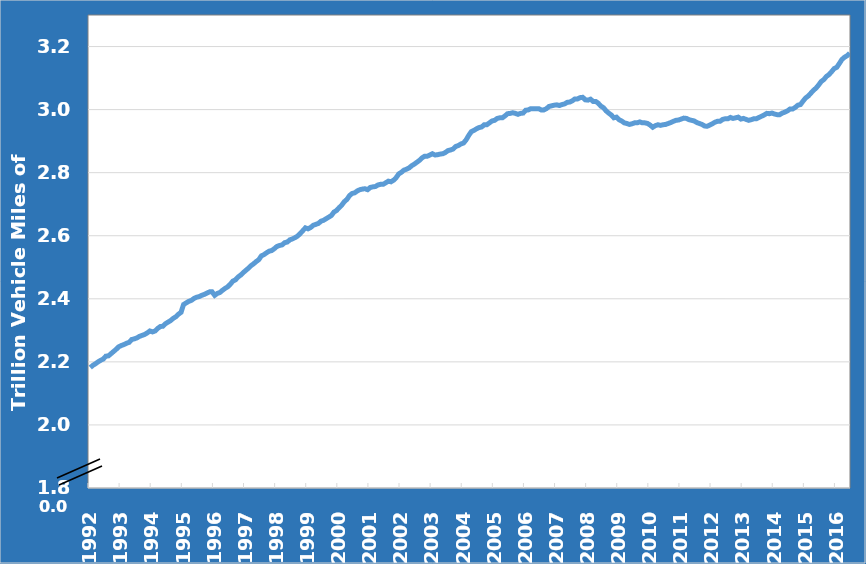
| Category | Series 0 |
|---|---|
| 1992 | 2.182 |
| 1992 | 2.189 |
| 1992 | 2.194 |
| 1992 | 2.2 |
| 1992 | 2.205 |
| 1992 | 2.209 |
| 1992 | 2.218 |
| 1992 | 2.219 |
| 1992 | 2.226 |
| 1992 | 2.233 |
| 1992 | 2.24 |
| 1992 | 2.248 |
| 1993 | 2.252 |
| 1993 | 2.255 |
| 1993 | 2.259 |
| 1993 | 2.262 |
| 1993 | 2.271 |
| 1993 | 2.273 |
| 1993 | 2.276 |
| 1993 | 2.281 |
| 1993 | 2.284 |
| 1993 | 2.287 |
| 1993 | 2.292 |
| 1993 | 2.298 |
| 1994 | 2.295 |
| 1994 | 2.298 |
| 1994 | 2.306 |
| 1994 | 2.312 |
| 1994 | 2.313 |
| 1994 | 2.321 |
| 1994 | 2.326 |
| 1994 | 2.331 |
| 1994 | 2.338 |
| 1994 | 2.343 |
| 1994 | 2.351 |
| 1994 | 2.357 |
| 1995 | 2.382 |
| 1995 | 2.387 |
| 1995 | 2.392 |
| 1995 | 2.395 |
| 1995 | 2.401 |
| 1995 | 2.405 |
| 1995 | 2.407 |
| 1995 | 2.411 |
| 1995 | 2.414 |
| 1995 | 2.418 |
| 1995 | 2.422 |
| 1995 | 2.422 |
| 1996 | 2.411 |
| 1996 | 2.417 |
| 1996 | 2.42 |
| 1996 | 2.427 |
| 1996 | 2.433 |
| 1996 | 2.438 |
| 1996 | 2.446 |
| 1996 | 2.456 |
| 1996 | 2.46 |
| 1996 | 2.469 |
| 1996 | 2.475 |
| 1996 | 2.483 |
| 1997 | 2.49 |
| 1997 | 2.497 |
| 1997 | 2.505 |
| 1997 | 2.511 |
| 1997 | 2.518 |
| 1997 | 2.524 |
| 1997 | 2.536 |
| 1997 | 2.54 |
| 1997 | 2.546 |
| 1997 | 2.551 |
| 1997 | 2.553 |
| 1997 | 2.559 |
| 1998 | 2.566 |
| 1998 | 2.569 |
| 1998 | 2.571 |
| 1998 | 2.578 |
| 1998 | 2.58 |
| 1998 | 2.587 |
| 1998 | 2.59 |
| 1998 | 2.594 |
| 1998 | 2.599 |
| 1998 | 2.607 |
| 1998 | 2.616 |
| 1998 | 2.625 |
| 1999 | 2.622 |
| 1999 | 2.626 |
| 1999 | 2.633 |
| 1999 | 2.636 |
| 1999 | 2.639 |
| 1999 | 2.646 |
| 1999 | 2.649 |
| 1999 | 2.654 |
| 1999 | 2.659 |
| 1999 | 2.664 |
| 1999 | 2.675 |
| 1999 | 2.68 |
| 2000 | 2.689 |
| 2000 | 2.697 |
| 2000 | 2.708 |
| 2000 | 2.715 |
| 2000 | 2.727 |
| 2000 | 2.734 |
| 2000 | 2.736 |
| 2000 | 2.742 |
| 2000 | 2.746 |
| 2000 | 2.748 |
| 2000 | 2.749 |
| 2000 | 2.746 |
| 2001 | 2.753 |
| 2001 | 2.755 |
| 2001 | 2.756 |
| 2001 | 2.761 |
| 2001 | 2.763 |
| 2001 | 2.763 |
| 2001 | 2.768 |
| 2001 | 2.773 |
| 2001 | 2.771 |
| 2001 | 2.776 |
| 2001 | 2.784 |
| 2001 | 2.796 |
| 2002 | 2.801 |
| 2002 | 2.808 |
| 2002 | 2.811 |
| 2002 | 2.815 |
| 2002 | 2.822 |
| 2002 | 2.827 |
| 2002 | 2.833 |
| 2002 | 2.839 |
| 2002 | 2.847 |
| 2002 | 2.852 |
| 2002 | 2.852 |
| 2002 | 2.856 |
| 2003 | 2.86 |
| 2003 | 2.856 |
| 2003 | 2.857 |
| 2003 | 2.859 |
| 2003 | 2.86 |
| 2003 | 2.864 |
| 2003 | 2.87 |
| 2003 | 2.872 |
| 2003 | 2.875 |
| 2003 | 2.883 |
| 2003 | 2.886 |
| 2003 | 2.891 |
| 2004 | 2.894 |
| 2004 | 2.904 |
| 2004 | 2.918 |
| 2004 | 2.93 |
| 2004 | 2.934 |
| 2004 | 2.939 |
| 2004 | 2.943 |
| 2004 | 2.945 |
| 2004 | 2.952 |
| 2004 | 2.952 |
| 2004 | 2.958 |
| 2004 | 2.964 |
| 2005 | 2.966 |
| 2005 | 2.972 |
| 2005 | 2.974 |
| 2005 | 2.974 |
| 2005 | 2.98 |
| 2005 | 2.987 |
| 2005 | 2.988 |
| 2005 | 2.99 |
| 2005 | 2.988 |
| 2005 | 2.985 |
| 2005 | 2.988 |
| 2005 | 2.989 |
| 2006 | 2.998 |
| 2006 | 2.999 |
| 2006 | 3.003 |
| 2006 | 3.003 |
| 2006 | 3.003 |
| 2006 | 3.003 |
| 2006 | 2.999 |
| 2006 | 2.999 |
| 2006 | 3.003 |
| 2006 | 3.01 |
| 2006 | 3.012 |
| 2006 | 3.014 |
| 2007 | 3.015 |
| 2007 | 3.013 |
| 2007 | 3.016 |
| 2007 | 3.018 |
| 2007 | 3.023 |
| 2007 | 3.024 |
| 2007 | 3.028 |
| 2007 | 3.034 |
| 2007 | 3.034 |
| 2007 | 3.038 |
| 2007 | 3.039 |
| 2007 | 3.031 |
| 2008 | 3.03 |
| 2008 | 3.033 |
| 2008 | 3.026 |
| 2008 | 3.026 |
| 2008 | 3.02 |
| 2008 | 3.011 |
| 2008 | 3.006 |
| 2008 | 2.996 |
| 2008 | 2.989 |
| 2008 | 2.983 |
| 2008 | 2.974 |
| 2008 | 2.976 |
| 2009 | 2.968 |
| 2009 | 2.964 |
| 2009 | 2.958 |
| 2009 | 2.956 |
| 2009 | 2.953 |
| 2009 | 2.955 |
| 2009 | 2.958 |
| 2009 | 2.958 |
| 2009 | 2.961 |
| 2009 | 2.958 |
| 2009 | 2.958 |
| 2009 | 2.956 |
| 2010 | 2.951 |
| 2010 | 2.944 |
| 2010 | 2.949 |
| 2010 | 2.952 |
| 2010 | 2.95 |
| 2010 | 2.952 |
| 2010 | 2.953 |
| 2010 | 2.956 |
| 2010 | 2.959 |
| 2010 | 2.963 |
| 2010 | 2.966 |
| 2010 | 2.967 |
| 2011 | 2.97 |
| 2011 | 2.973 |
| 2011 | 2.972 |
| 2011 | 2.968 |
| 2011 | 2.966 |
| 2011 | 2.964 |
| 2011 | 2.959 |
| 2011 | 2.956 |
| 2011 | 2.953 |
| 2011 | 2.948 |
| 2011 | 2.947 |
| 2011 | 2.951 |
| 2012 | 2.955 |
| 2012 | 2.96 |
| 2012 | 2.963 |
| 2012 | 2.963 |
| 2012 | 2.969 |
| 2012 | 2.971 |
| 2012 | 2.971 |
| 2012 | 2.975 |
| 2012 | 2.972 |
| 2012 | 2.974 |
| 2012 | 2.976 |
| 2012 | 2.97 |
| 2013 | 2.972 |
| 2013 | 2.969 |
| 2013 | 2.966 |
| 2013 | 2.968 |
| 2013 | 2.971 |
| 2013 | 2.971 |
| 2013 | 2.975 |
| 2013 | 2.979 |
| 2013 | 2.983 |
| 2013 | 2.988 |
| 2013 | 2.987 |
| 2013 | 2.989 |
| 2014 | 2.986 |
| 2014 | 2.984 |
| 2014 | 2.984 |
| 2014 | 2.989 |
| 2014 | 2.992 |
| 2014 | 2.996 |
| 2014 | 3.002 |
| 2014 | 3.002 |
| 2014 | 3.007 |
| 2014 | 3.014 |
| 2014 | 3.016 |
| 2014 | 3.027 |
| 2015 | 3.037 |
| 2015 | 3.043 |
| 2015 | 3.052 |
| 2015 | 3.061 |
| 2015 | 3.068 |
| 2015 | 3.078 |
| 2015 | 3.089 |
| 2015 | 3.095 |
| 2015 | 3.105 |
| 2015 | 3.111 |
| 2015 | 3.12 |
| 2015 | 3.13 |
| 2016 | 3.134 |
| 2016 | 3.146 |
| 2016 | 3.159 |
| 2016 | 3.166 |
| 2016 | 3.171 |
| 2016 | 3.179 |